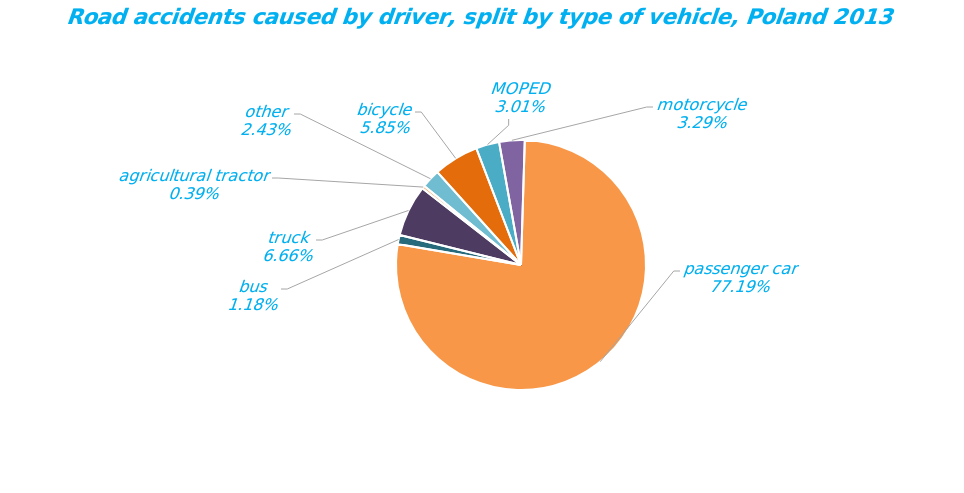
| Category | Series 0 |
|---|---|
| bicycle | 1716 |
| MOPED | 884 |
| motorcycle | 967 |
| passenger car | 22659 |
| bus | 347 |
| truck | 1954 |
| agricultural tractor | 114 |
| other | 713 |